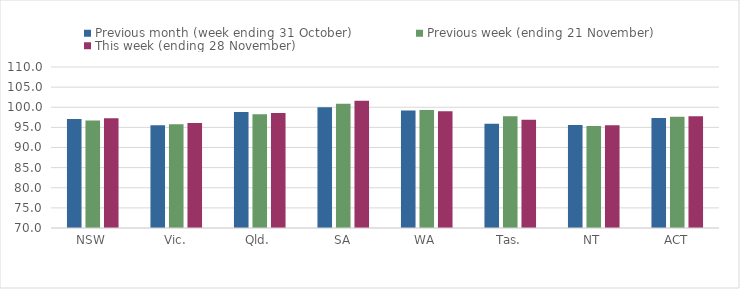
| Category | Previous month (week ending 31 October) | Previous week (ending 21 November) | This week (ending 28 November) |
|---|---|---|---|
| NSW | 97.09 | 96.72 | 97.25 |
| Vic. | 95.54 | 95.75 | 96.08 |
| Qld. | 98.79 | 98.26 | 98.56 |
| SA | 99.99 | 100.89 | 101.63 |
| WA | 99.21 | 99.29 | 99 |
| Tas. | 95.91 | 97.78 | 96.92 |
| NT | 95.62 | 95.34 | 95.55 |
| ACT | 97.32 | 97.66 | 97.76 |